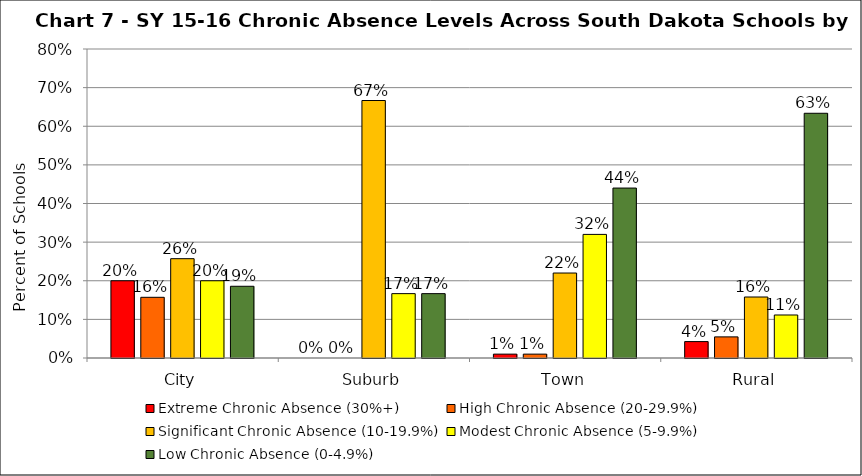
| Category | Extreme Chronic Absence (30%+) | High Chronic Absence (20-29.9%) | Significant Chronic Absence (10-19.9%) | Modest Chronic Absence (5-9.9%) | Low Chronic Absence (0-4.9%) |
|---|---|---|---|---|---|
| 0 | 0.2 | 0.157 | 0.257 | 0.2 | 0.186 |
| 1 | 0 | 0 | 0.667 | 0.167 | 0.167 |
| 2 | 0.01 | 0.01 | 0.22 | 0.32 | 0.44 |
| 3 | 0.043 | 0.055 | 0.158 | 0.111 | 0.634 |